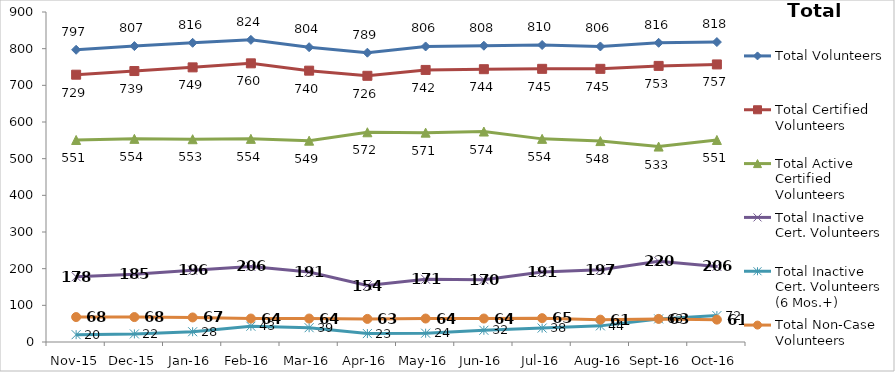
| Category | Total Volunteers | Total Certified Volunteers | Total Active Certified Volunteers | Total Inactive Cert. Volunteers | Total Inactive Cert. Volunteers (6 Mos.+) | Total Non-Case Volunteers |
|---|---|---|---|---|---|---|
| Nov-15 | 797 | 729 | 551 | 178 | 20 | 68 |
| Dec-15 | 807 | 739 | 554 | 185 | 22 | 68 |
| Jan-16 | 816 | 749 | 553 | 196 | 28 | 67 |
| Feb-16 | 824 | 760 | 554 | 206 | 43 | 64 |
| Mar-16 | 804 | 740 | 549 | 191 | 39 | 64 |
| Apr-16 | 789 | 726 | 572 | 154 | 23 | 63 |
| May-16 | 806 | 742 | 571 | 171 | 24 | 64 |
| Jun-16 | 808 | 744 | 574 | 170 | 32 | 64 |
| Jul-16 | 810 | 745 | 554 | 191 | 38 | 65 |
| Aug-16 | 806 | 745 | 548 | 197 | 44 | 61 |
| Sep-16 | 816 | 753 | 533 | 220 | 63 | 63 |
| Oct-16 | 818 | 757 | 551 | 206 | 72 | 61 |